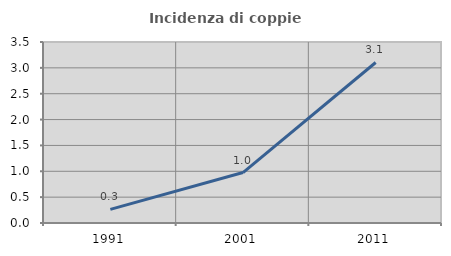
| Category | Incidenza di coppie miste |
|---|---|
| 1991.0 | 0.264 |
| 2001.0 | 0.976 |
| 2011.0 | 3.104 |